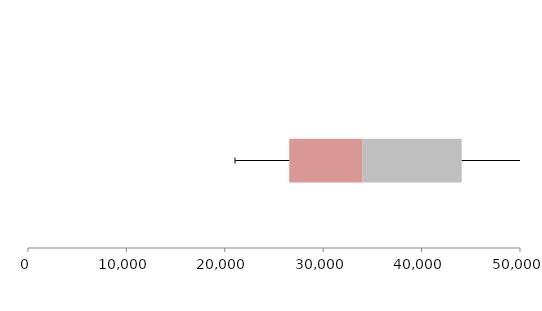
| Category | Series 1 | Series 2 | Series 3 |
|---|---|---|---|
| 0 | 26551.687 | 7452.876 | 10071.205 |